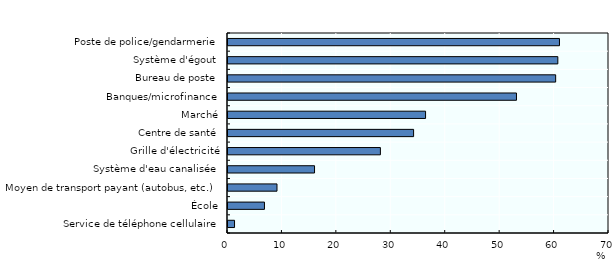
| Category | Series 0 |
|---|---|
| Service de téléphone cellulaire | 1.2 |
| École | 6.7 |
| Moyen de transport payant (autobus, etc.) | 9 |
| Système d'eau canalisée | 15.9 |
| Grille d'électricité | 28 |
| Centre de santé | 34.1 |
| Marché | 36.3 |
| Banques/microfinance | 53 |
| Bureau de poste | 60.2 |
| Système d'égout | 60.6 |
| Poste de police/gendarmerie | 60.9 |